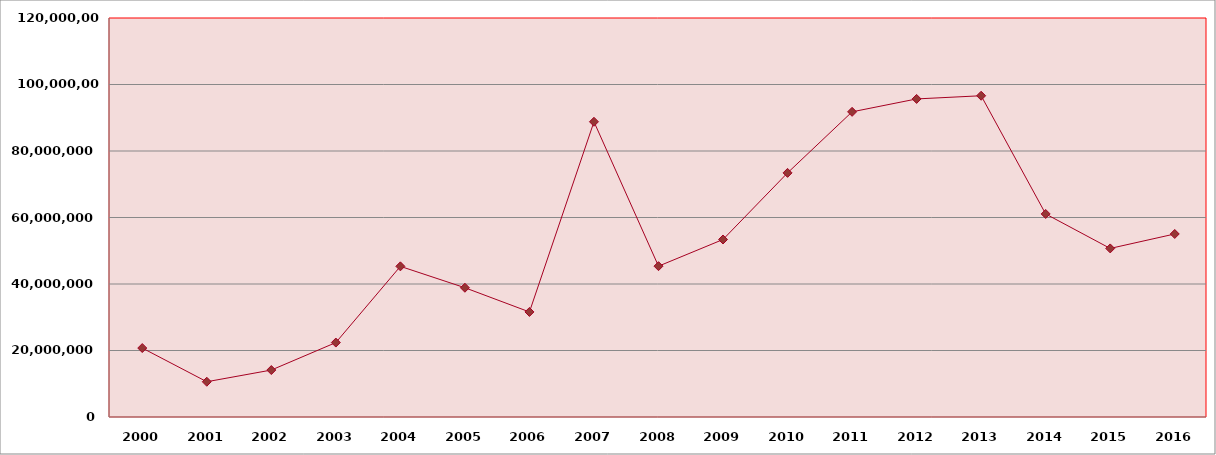
| Category | Valores em US$/FOB |
|---|---|
| 2000.0 | 20740658 |
| 2001.0 | 10602864 |
| 2002.0 | 14117059 |
| 2003.0 | 22384614 |
| 2004.0 | 45308841 |
| 2005.0 | 38876528 |
| 2006.0 | 31595636 |
| 2007.0 | 88790438 |
| 2008.0 | 45364051 |
| 2009.0 | 53386714 |
| 2010.0 | 73417244 |
| 2011.0 | 91778158 |
| 2012.0 | 95662079 |
| 2013.0 | 96619009 |
| 2014.0 | 61068065 |
| 2015.0 | 50696538 |
| 2016.0 | 55042964 |